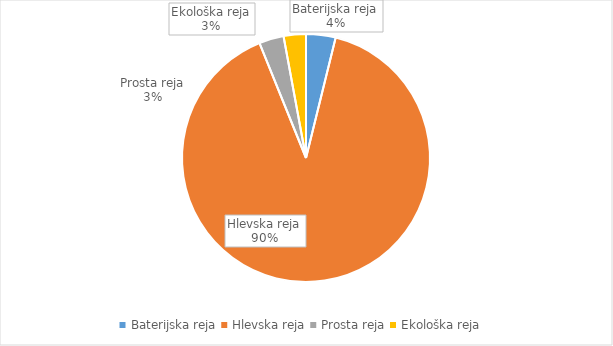
| Category | Količina kosov jajc |
|---|---|
| Baterijska reja | 109731 |
| Hlevska reja | 2567717 |
| Prosta reja | 91716 |
| Ekološka reja | 82840 |